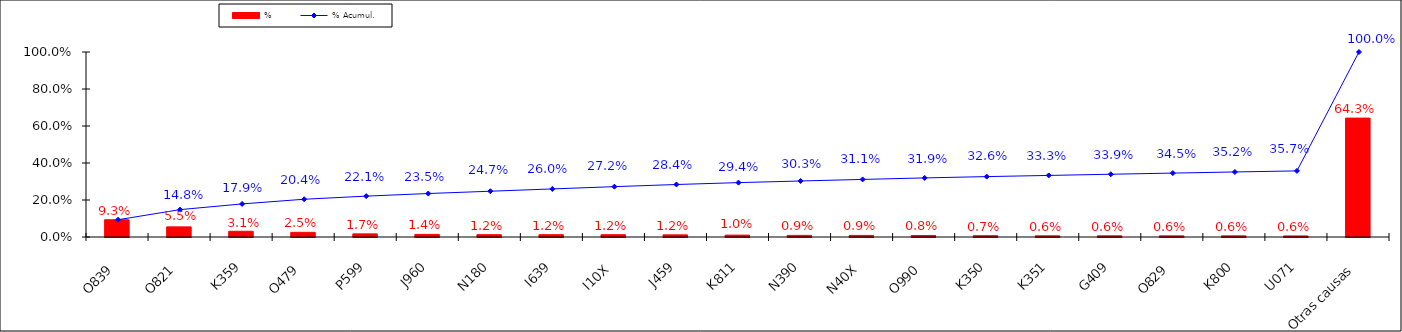
| Category | % |
|---|---|
| O839 | 0.093 |
| O821 | 0.055 |
| K359 | 0.031 |
| O479 | 0.025 |
| P599 | 0.017 |
| J960 | 0.014 |
| N180 | 0.012 |
| I639 | 0.012 |
| I10X | 0.012 |
| J459 | 0.012 |
| K811 | 0.01 |
| N390 | 0.009 |
| N40X | 0.009 |
| O990 | 0.008 |
| K350 | 0.007 |
| K351 | 0.006 |
| G409 | 0.006 |
| O829 | 0.006 |
| K800 | 0.006 |
| U071 | 0.006 |
| Otras causas | 0.643 |